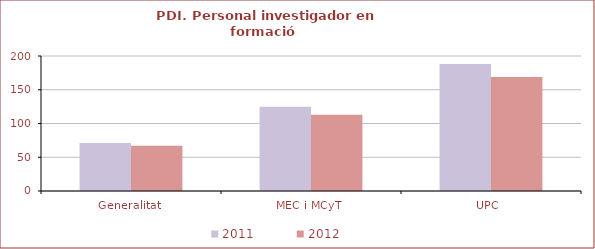
| Category | 2011 | 2012 |
|---|---|---|
| Generalitat | 71 | 67 |
| MEC i MCyT | 125 | 113 |
| UPC  | 188 | 169 |